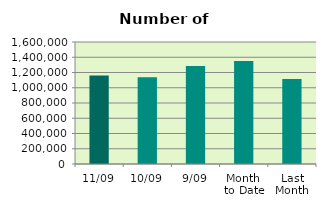
| Category | Series 0 |
|---|---|
| 11/09 | 1161668 |
| 10/09 | 1136816 |
| 9/09 | 1286448 |
| Month 
to Date | 1351843.556 |
| Last
Month | 1113186.286 |